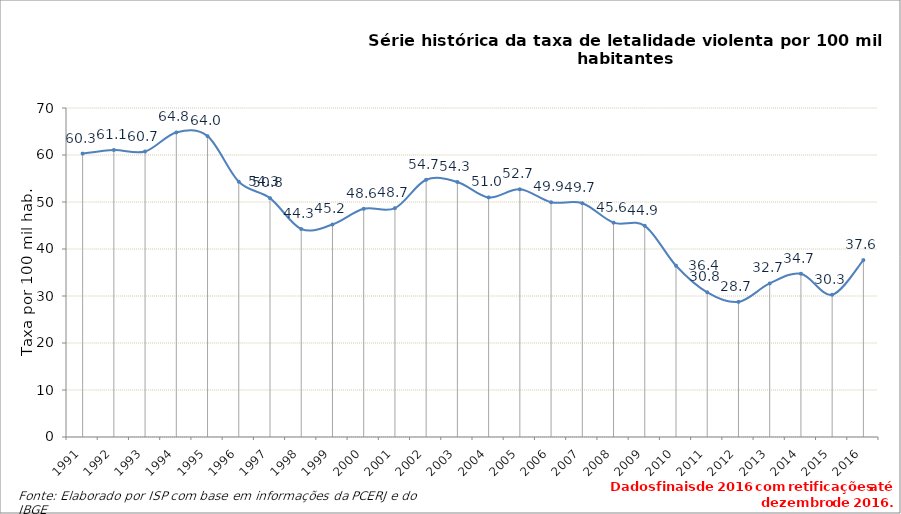
| Category | Series 0 |
|---|---|
| 1991.0 | 60.3 |
| 1992.0 | 61.059 |
| 1993.0 | 60.739 |
| 1994.0 | 64.802 |
| 1995.0 | 64.014 |
| 1996.0 | 54.312 |
| 1997.0 | 50.828 |
| 1998.0 | 44.254 |
| 1999.0 | 45.214 |
| 2000.0 | 48.55 |
| 2001.0 | 48.687 |
| 2002.0 | 54.732 |
| 2003.0 | 54.253 |
| 2004.0 | 50.972 |
| 2005.0 | 52.703 |
| 2006.0 | 49.946 |
| 2007.0 | 49.743 |
| 2008.0 | 45.601 |
| 2009.0 | 44.931 |
| 2010.0 | 36.448 |
| 2011.0 | 30.783 |
| 2012.0 | 28.747 |
| 2013.0 | 32.671 |
| 2014.0 | 34.742 |
| 2015.0 | 30.272 |
| 2016.0 | 37.641 |